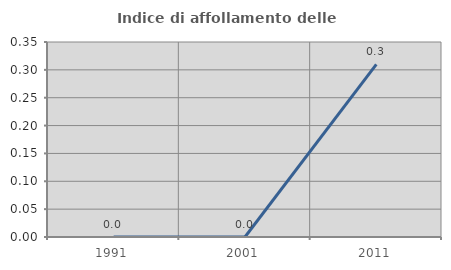
| Category | Indice di affollamento delle abitazioni  |
|---|---|
| 1991.0 | 0 |
| 2001.0 | 0 |
| 2011.0 | 0.31 |